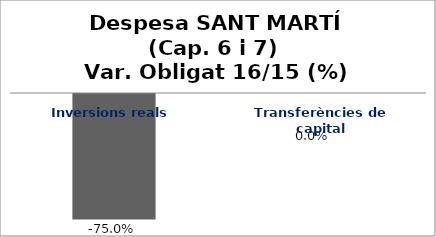
| Category | Series 0 |
|---|---|
| Inversions reals | -0.75 |
| Transferències de capital | 0 |